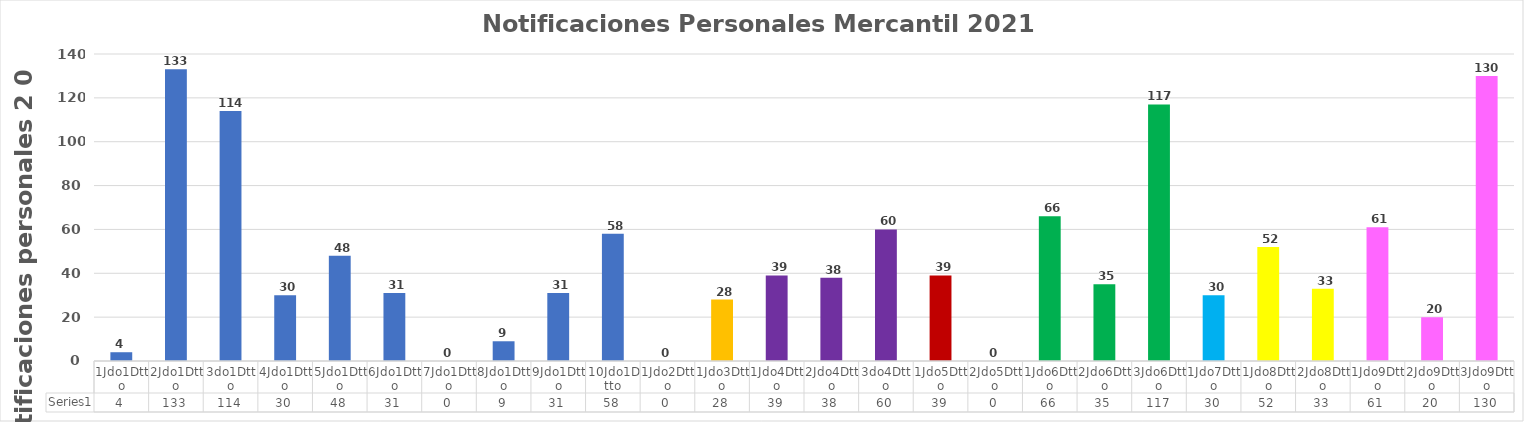
| Category | Series 0 |
|---|---|
| 1Jdo1Dtto | 4 |
| 2Jdo1Dtto | 133 |
| 3do1Dtto | 114 |
| 4Jdo1Dtto | 30 |
| 5Jdo1Dtto | 48 |
| 6Jdo1Dtto | 31 |
| 7Jdo1Dtto | 0 |
| 8Jdo1Dtto | 9 |
| 9Jdo1Dtto | 31 |
| 10Jdo1Dtto | 58 |
| 1Jdo2Dtto | 0 |
| 1Jdo3Dtto | 28 |
| 1Jdo4Dtto | 39 |
| 2Jdo4Dtto | 38 |
| 3do4Dtto | 60 |
| 1Jdo5Dtto | 39 |
| 2Jdo5Dtto | 0 |
| 1Jdo6Dtto | 66 |
| 2Jdo6Dtto | 35 |
| 3Jdo6Dtto | 117 |
| 1Jdo7Dtto | 30 |
| 1Jdo8Dtto | 52 |
| 2Jdo8Dtto | 33 |
| 1Jdo9Dtto | 61 |
| 2Jdo9Dtto | 20 |
| 3Jdo9Dtto | 130 |